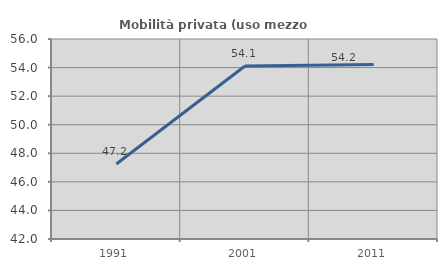
| Category | Mobilità privata (uso mezzo privato) |
|---|---|
| 1991.0 | 47.249 |
| 2001.0 | 54.111 |
| 2011.0 | 54.217 |